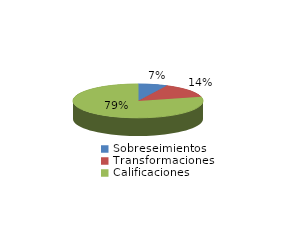
| Category | Series 0 |
|---|---|
| Sobreseimientos | 24 |
| Transformaciones | 46 |
| Calificaciones | 261 |